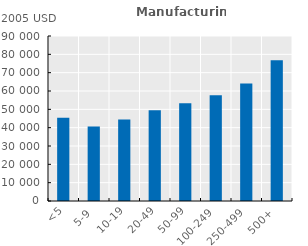
| Category | Series 0 |
|---|---|
| <5 | 45375.262 |
| 5-9 | 40669.137 |
| 10-19 | 44420.297 |
| 20-49 | 49450.449 |
| 50-99 | 53326.156 |
| 100-249 | 57618.734 |
| 250-499 | 64077.324 |
| 500+ | 76817.117 |